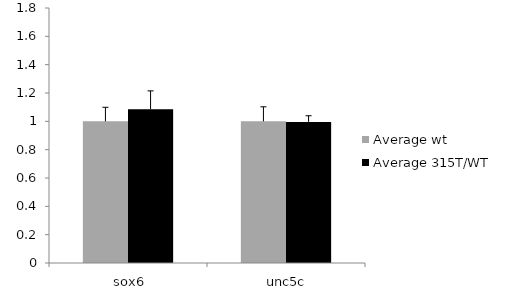
| Category | Average wt | Average 315T/WT |
|---|---|---|
|  sox6 | 1 | 1.086 |
|  unc5c | 1 | 0.996 |